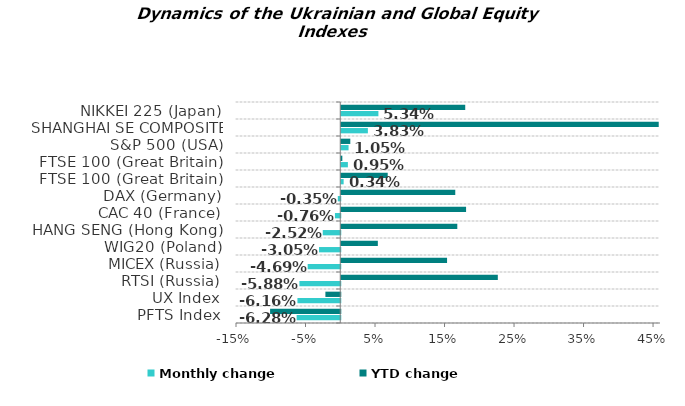
| Category | Monthly change | YTD change |
|---|---|---|
| PFTS Index | -0.063 | -0.101 |
| UX Index | -0.062 | -0.021 |
| RTSI (Russia) | -0.059 | 0.225 |
| MICEX (Russia) | -0.047 | 0.152 |
| WIG20 (Poland) | -0.031 | 0.053 |
| HANG SENG (Hong Kong) | -0.025 | 0.167 |
| CAC 40 (France) | -0.008 | 0.18 |
| DAX (Germany) | -0.004 | 0.164 |
| FTSE 100 (Great Britain) | 0.003 | 0.067 |
| FTSE 100 (Great Britain) | 0.01 | 0.002 |
| S&P 500 (USA) | 0.01 | 0.013 |
| SHANGHAI SE COMPOSITE (China) | 0.038 | 0.457 |
| NIKKEI 225 (Japan) | 0.053 | 0.178 |